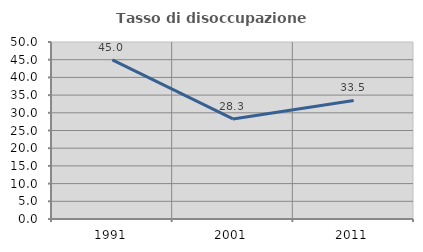
| Category | Tasso di disoccupazione giovanile  |
|---|---|
| 1991.0 | 44.968 |
| 2001.0 | 28.27 |
| 2011.0 | 33.483 |